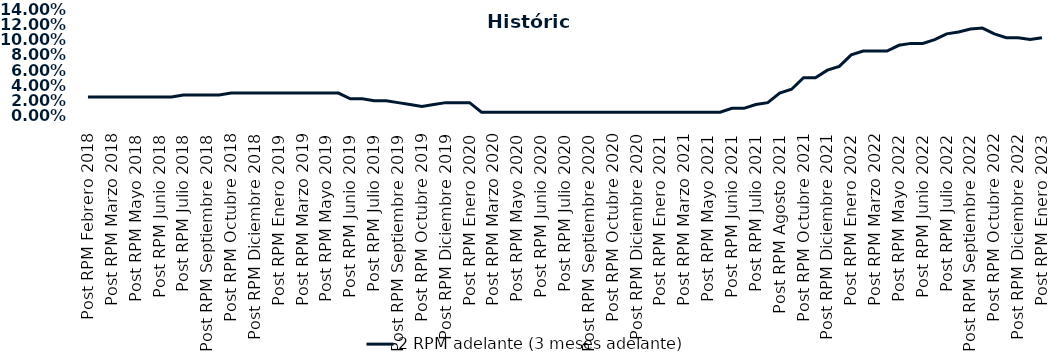
| Category | 2 RPM adelante (3 meses adelante) |
|---|---|
| Post RPM Febrero 2018 | 0.025 |
| Pre RPM Marzo 2018 | 0.025 |
| Post RPM Marzo 2018 | 0.025 |
| Pre RPM Mayo 2018 | 0.025 |
| Post RPM Mayo 2018 | 0.025 |
| Pre RPM Junio 2018 | 0.025 |
| Post RPM Junio 2018 | 0.025 |
| Pre RPM Julio 2018 | 0.025 |
| Post RPM Julio 2018 | 0.028 |
| Pre RPM Septiembre 2018 | 0.028 |
| Post RPM Septiembre 2018 | 0.028 |
| Pre RPM Octubre 2018 | 0.028 |
| Post RPM Octubre 2018 | 0.03 |
| Pre RPM Diciembre 2018 | 0.03 |
| Post RPM Diciembre 2018 | 0.03 |
| Pre RPM Enero 2019 | 0.03 |
| Post RPM Enero 2019 | 0.03 |
| Pre RPM Marzo 2019 | 0.03 |
| Post RPM Marzo 2019 | 0.03 |
| Pre RPM Mayo 2019 | 0.03 |
| Post RPM Mayo 2019 | 0.03 |
| Pre RPM Junio 2019 | 0.03 |
| Post RPM Junio 2019 | 0.022 |
| Pre RPM Julio 2019 | 0.022 |
| Post RPM Julio 2019 | 0.02 |
| Pre RPM Septiembre 2019 | 0.02 |
| Post RPM Septiembre 2019 | 0.018 |
| Pre RPM Octubre 2019 | 0.015 |
| Post RPM Octubre 2019 | 0.012 |
| Pre RPM Diciembre 2019 | 0.015 |
| Post RPM Diciembre 2019 | 0.018 |
| Pre RPM Enero 2020 | 0.018 |
| Post RPM Enero 2020 | 0.018 |
| Pre RPM Marzo 2020 | 0.005 |
| Post RPM Marzo 2020 | 0.005 |
| Pre RPM Mayo 2020 | 0.005 |
| Post RPM Mayo 2020 | 0.005 |
| Pre RPM Junio 2020 | 0.005 |
| Post RPM Junio 2020 | 0.005 |
| Pre RPM Julio 2020 | 0.005 |
| Post RPM Julio 2020 | 0.005 |
| Pre RPM Septiembre 2020 | 0.005 |
| Post RPM Septiembre 2020 | 0.005 |
| Pre RPM Octubre 2020 | 0.005 |
| Post RPM Octubre 2020 | 0.005 |
| Pre RPM Diciembre 2020 | 0.005 |
| Post RPM Diciembre 2020 | 0.005 |
| Pre RPM Enero 2021 | 0.005 |
| Post RPM Enero 2021 | 0.005 |
| Pre RPM Marzo 2021 | 0.005 |
| Post RPM Marzo 2021 | 0.005 |
| Pre RPM Mayo 2021 | 0.005 |
| Post RPM Mayo 2021 | 0.005 |
| Pre RPM Junio 2021 | 0.005 |
| Post RPM Junio 2021 | 0.01 |
| Pre RPM Julio 2021 | 0.01 |
| Post RPM Julio 2021 | 0.015 |
| Pre RPM Agosto 2021 | 0.018 |
| Post RPM Agosto 2021 | 0.03 |
| Pre RPM Octubre 2021 | 0.035 |
| Post RPM Octubre 2021 | 0.05 |
| Pre RPM Diciembre 2021 | 0.05 |
| Post RPM Diciembre 2021 | 0.06 |
| Pre RPM Enero 2022 | 0.065 |
| Post RPM Enero 2022 | 0.08 |
| Pre RPM Marzo 2022 | 0.085 |
| Post RPM Marzo 2022 | 0.085 |
| Pre RPM Mayo 2022 | 0.085 |
| Post RPM Mayo 2022 | 0.092 |
| Pre RPM Junio 2022 | 0.095 |
| Post RPM Junio 2022 | 0.095 |
| Pre RPM Julio 2022 | 0.1 |
| Post RPM Julio 2022 | 0.108 |
| Pre RPM Septiembre 2022 | 0.11 |
| Post RPM Septiembre 2022 | 0.114 |
| Pre RPM Octubre 2022 | 0.115 |
| Post RPM Octubre 2022 | 0.108 |
| Pre RPM Diciembre 2022 | 0.102 |
| Post RPM Diciembre 2022 | 0.102 |
| Pre RPM Enero 2023 | 0.1 |
| Post RPM Enero 2023 | 0.102 |